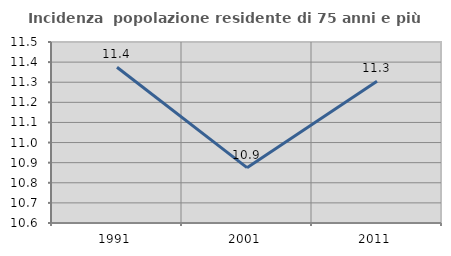
| Category | Incidenza  popolazione residente di 75 anni e più |
|---|---|
| 1991.0 | 11.374 |
| 2001.0 | 10.875 |
| 2011.0 | 11.305 |